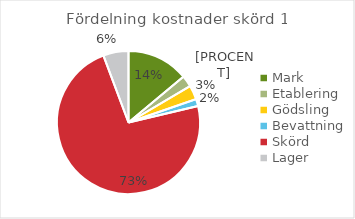
| Category | kr/kg ts |
|---|---|
| Mark | 0.302 |
| Etablering | 0.055 |
| Gödsling | 0.07 |
| Bevattning | 0.035 |
| Skörd | 1.581 |
| Lager | 0.124 |